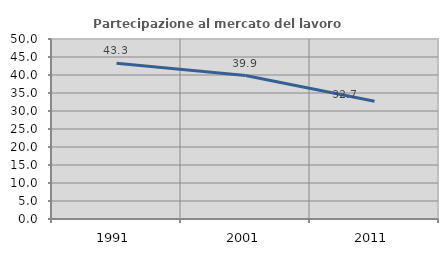
| Category | Partecipazione al mercato del lavoro  femminile |
|---|---|
| 1991.0 | 43.288 |
| 2001.0 | 39.855 |
| 2011.0 | 32.712 |